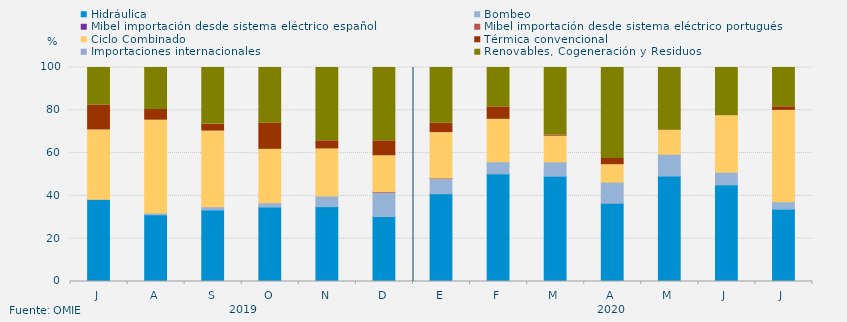
| Category | Hidráulica | Bombeo | Mibel importación desde sistema eléctrico español | Mibel importación desde sistema eléctrico portugués | Ciclo Combinado | Térmica convencional | Importaciones internacionales | Renovables, Cogeneración y Residuos |
|---|---|---|---|---|---|---|---|---|
| J | 38.403 | 0.067 | 0 | 0 | 32.346 | 11.687 | 0 | 17.497 |
| A | 31.169 | 0.83 | 0 | 0 | 43.371 | 4.991 | 0 | 19.639 |
| S | 33.426 | 1.53 | 0 | 0 | 35.327 | 3.176 | 0 | 26.541 |
| O | 34.791 | 1.952 | 0 | 0 | 25.011 | 12.248 | 0 | 25.998 |
| N | 34.979 | 4.937 | 0 | 0 | 22.021 | 3.825 | 0 | 34.237 |
| D | 30.328 | 11.373 | 0 | 0.269 | 16.779 | 6.999 | 0 | 34.253 |
| E | 41.005 | 7.201 | 0 | 0.135 | 21.22 | 4.419 | 0 | 26.021 |
| F | 50.288 | 5.707 | 0 | 0 | 19.784 | 5.827 | 0 | 18.393 |
| M | 49.203 | 6.727 | 0 | 0 | 11.983 | 0.539 | 0 | 31.548 |
| A | 36.555 | 9.875 | 0 | 0 | 8.136 | 2.898 | 0 | 42.536 |
| M | 49.282 | 10.206 | 0 | 0 | 11.081 | 0.135 | 0 | 29.296 |
| J | 45.155 | 5.888 | 0 | 0 | 26.402 | 0 | 0 | 22.554 |
| J | 33.804 | 3.477 | 0 | 0 | 42.687 | 1.682 | 0 | 18.349 |